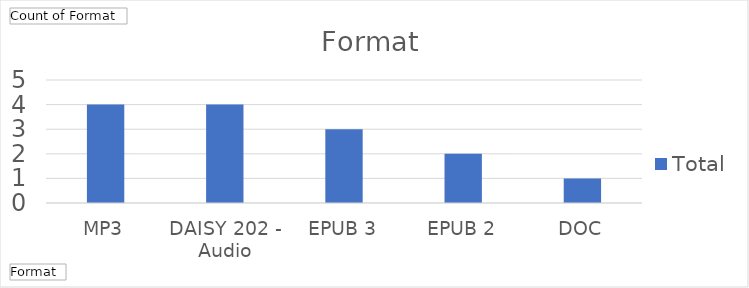
| Category | Total |
|---|---|
| MP3 | 4 |
| DAISY 202 - Audio | 4 |
| EPUB 3 | 3 |
| EPUB 2 | 2 |
| DOC | 1 |